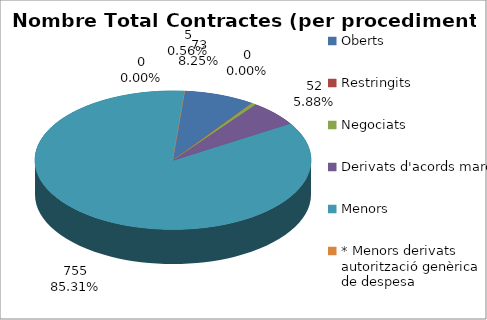
| Category | TOTALS Nombre Total Contractes | TOTALS % total contractes | TOTALS Total Import (€) | TOTALS % total import |
|---|---|---|---|---|
| Oberts | 73 | 0.082 | 10037265.51 | 0.372 |
| Restringits | 0 | 0 | 0 | 0 |
| Negociats | 5 | 0.006 | 560274.18 | 0.021 |
| Derivats d'acords marc | 52 | 0.059 | 2210198.93 | 0.082 |
| Menors  | 755 | 0.853 | 10123752.7 | 0.375 |
| * Menors derivats autorització genèrica de despesa | 0 | 0 | 4079645.32 | 0.151 |